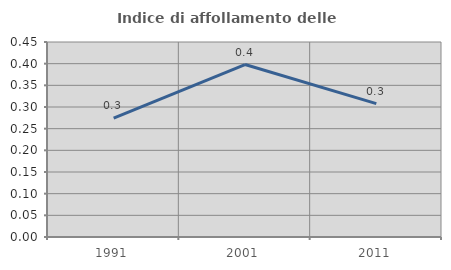
| Category | Indice di affollamento delle abitazioni  |
|---|---|
| 1991.0 | 0.275 |
| 2001.0 | 0.398 |
| 2011.0 | 0.308 |